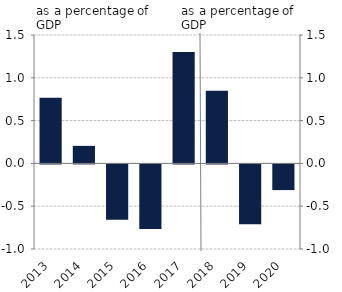
| Category | Fiskális impulzus |
|---|---|
| 2013.0 | 0.768 |
| 2014.0 | 0.205 |
| 2015.0 | -0.646 |
| 2016.0 | -0.755 |
| 2017.0 | 1.3 |
| 2018.0 | 0.85 |
| 2019.0 | -0.7 |
| 2020.0 | -0.3 |